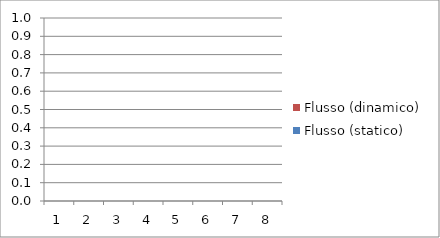
| Category | Flusso (dinamico) | Flusso (statico) |
|---|---|---|
| 1.0 | 0 | 0 |
| 2.0 | 0 | 0 |
| 3.0 | 0 | 0 |
| 4.0 | 0 | 0 |
| 5.0 | 0 | 0 |
| 6.0 | 0 | 0 |
| 7.0 | 0 | 0 |
| 8.0 | 0 | 0 |